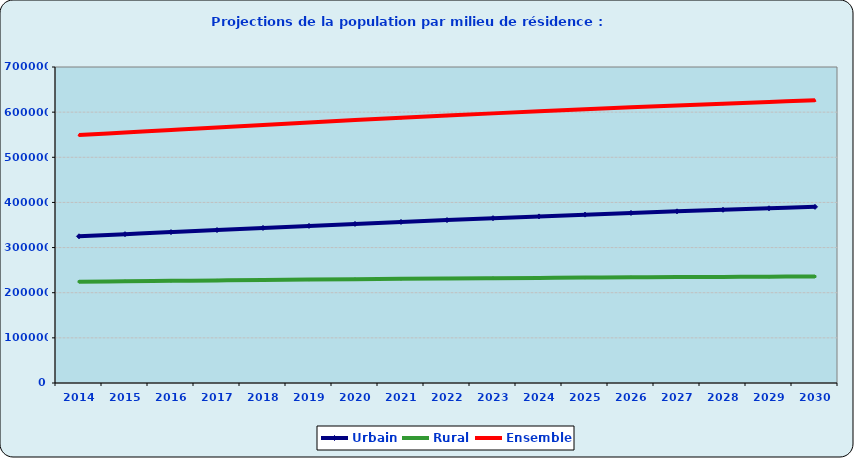
| Category | Urbain | Rural | Ensemble |
|---|---|---|---|
| 2014.0 | 325025 | 224405 | 549430 |
| 2015.0 | 329655 | 225339 | 554994 |
| 2016.0 | 334282 | 226292 | 560574 |
| 2017.0 | 338888 | 227246 | 566134 |
| 2018.0 | 343453 | 228182 | 571635 |
| 2019.0 | 347959 | 229083 | 577042 |
| 2020.0 | 352388 | 229940 | 582328 |
| 2021.0 | 356723 | 230748 | 587471 |
| 2022.0 | 360948 | 231504 | 592452 |
| 2023.0 | 365058 | 232209 | 597267 |
| 2024.0 | 369051 | 232868 | 601919 |
| 2025.0 | 372924 | 233483 | 606407 |
| 2026.0 | 376672 | 234059 | 610731 |
| 2027.0 | 380286 | 234592 | 614878 |
| 2028.0 | 383751 | 235082 | 618833 |
| 2029.0 | 387055 | 235528 | 622583 |
| 2030.0 | 390180 | 235928 | 626108 |